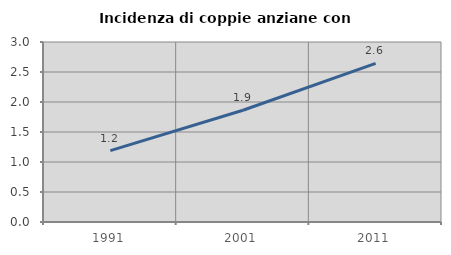
| Category | Incidenza di coppie anziane con figli |
|---|---|
| 1991.0 | 1.189 |
| 2001.0 | 1.863 |
| 2011.0 | 2.642 |